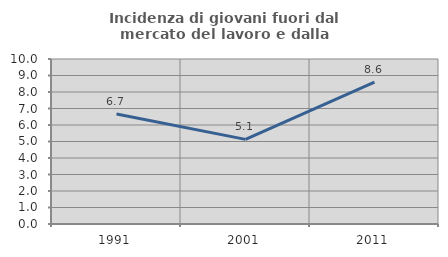
| Category | Incidenza di giovani fuori dal mercato del lavoro e dalla formazione  |
|---|---|
| 1991.0 | 6.667 |
| 2001.0 | 5.128 |
| 2011.0 | 8.594 |